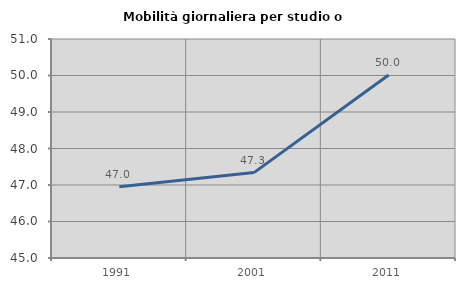
| Category | Mobilità giornaliera per studio o lavoro |
|---|---|
| 1991.0 | 46.954 |
| 2001.0 | 47.339 |
| 2011.0 | 50.014 |